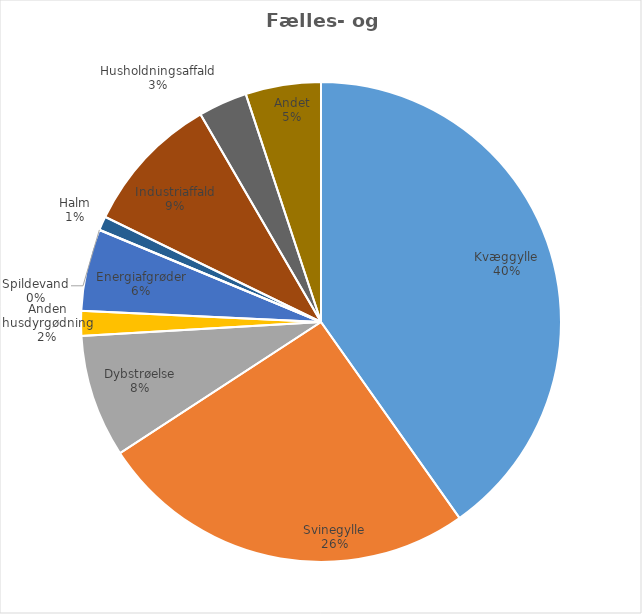
| Category | Series 0 |
|---|---|
| Kvæggylle | 5717080.21 |
| Svinegylle | 3638307.98 |
| Dybstrøelse | 1177499.5 |
| Anden husdyrgødning | 236409.63 |
| Energiafgrøder | 784506.57 |
| Spildevand | 2553 |
| Halm | 133053.01 |
| Industriaffald | 1339200.05 |
| Husholdningsaffald | 468822.79 |
| Andet | 721242.07 |